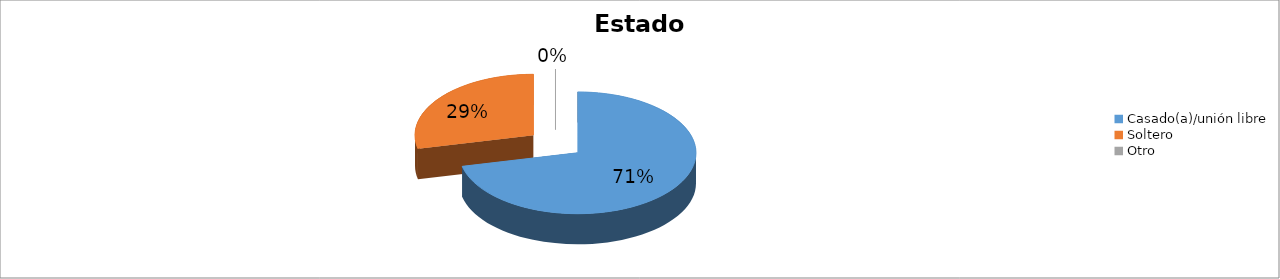
| Category | Series 0 |
|---|---|
| Casado(a)/unión libre | 0.714 |
| Soltero | 0.286 |
| Otro | 0 |